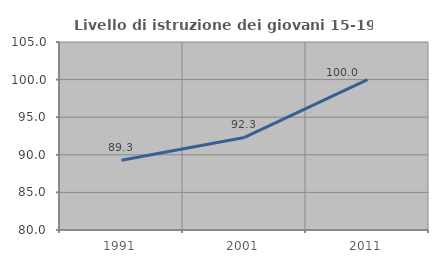
| Category | Livello di istruzione dei giovani 15-19 anni |
|---|---|
| 1991.0 | 89.286 |
| 2001.0 | 92.308 |
| 2011.0 | 100 |